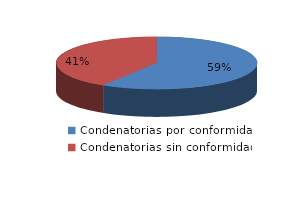
| Category | Series 0 |
|---|---|
| 0 | 677 |
| 1 | 474 |